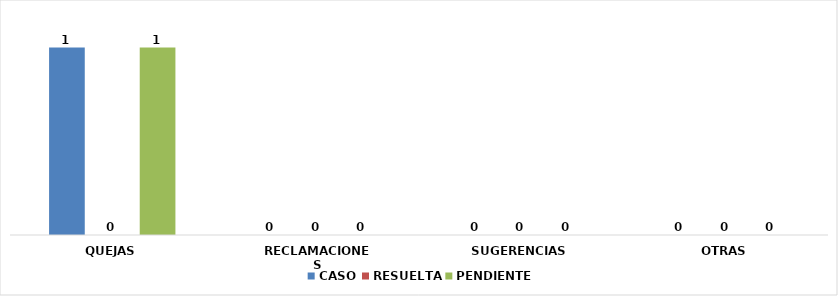
| Category | CASO | RESUELTA | PENDIENTE |
|---|---|---|---|
| QUEJAS | 1 | 0 | 1 |
| RECLAMACIONES | 0 | 0 | 0 |
| SUGERENCIAS | 0 | 0 | 0 |
| OTRAS | 0 | 0 | 0 |